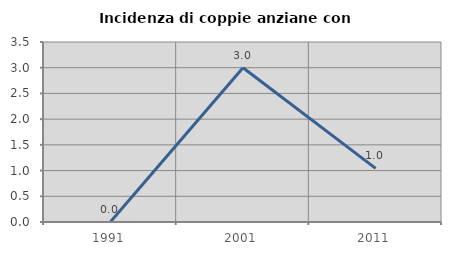
| Category | Incidenza di coppie anziane con figli |
|---|---|
| 1991.0 | 0 |
| 2001.0 | 3 |
| 2011.0 | 1.042 |